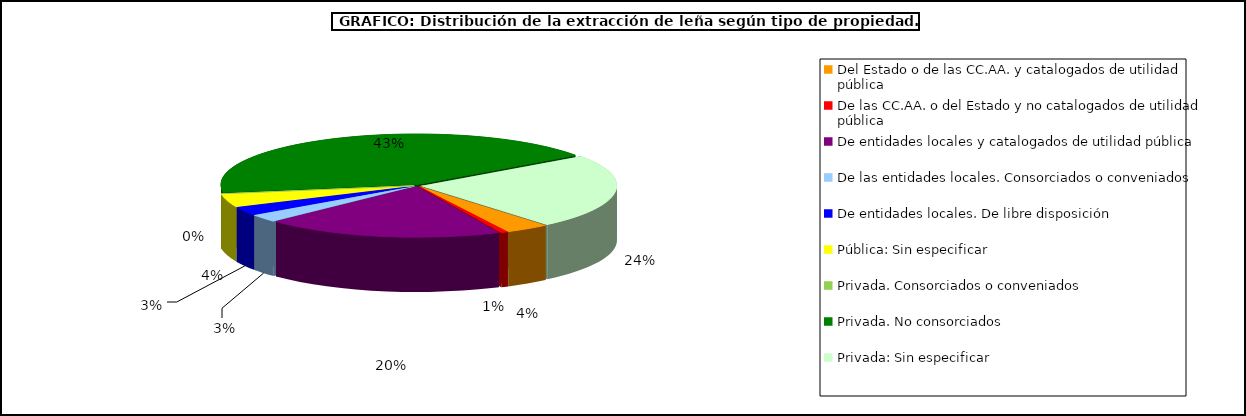
| Category | Series 0 |
|---|---|
| Del Estado o de las CC.AA. y catalogados de utilidad pública | 43874.5 |
| De las CC.AA. o del Estado y no catalogados de utilidad pública | 7001.66 |
| De entidades locales y catalogados de utilidad pública | 236668.47 |
| De las entidades locales. Consorciados o conveniados | 30061.1 |
| De entidades locales. De libre disposición | 33956.58 |
| Pública: Sin especificar | 51215.83 |
| Privada. Consorciados o conveniados | 258.88 |
| Privada. No consorciados | 512599.41 |
| Privada: Sin especificar | 285230.11 |